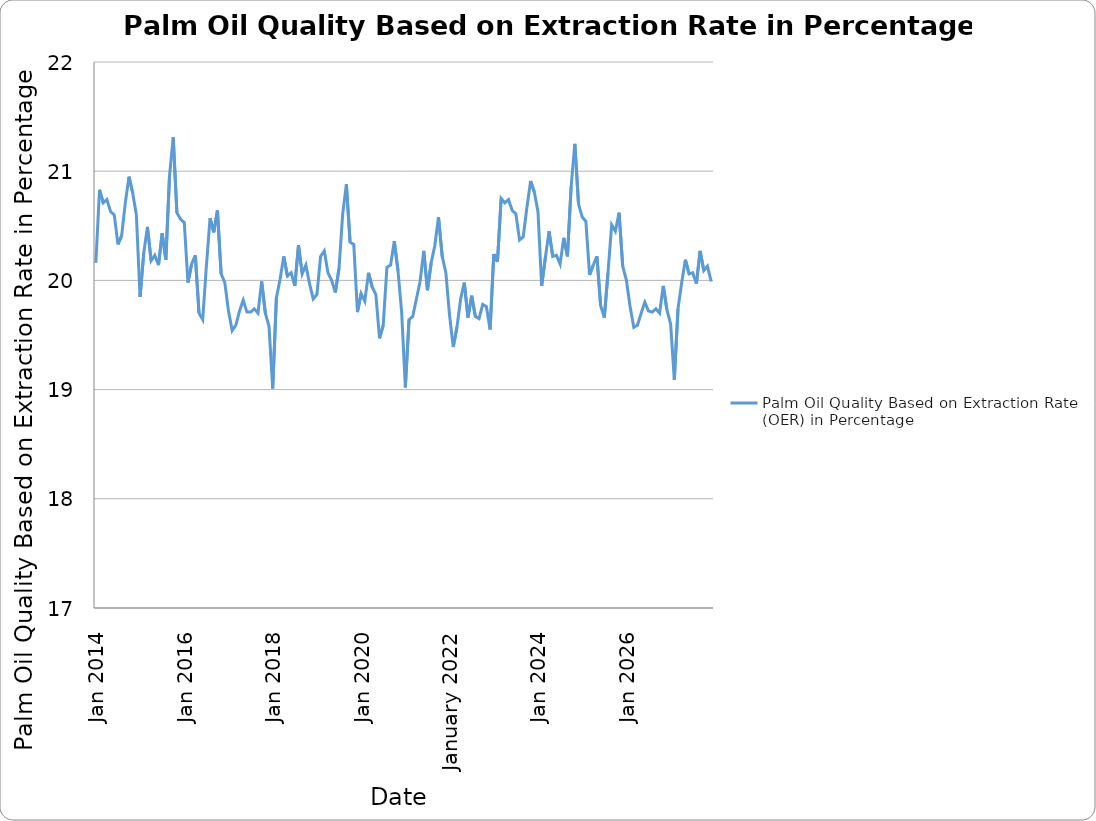
| Category | Palm Oil Quality Based on Extraction Rate (OER) in Percentage
 |
|---|---|
| 2014-01-01 | 20.16 |
| 2014-02-01 | 20.83 |
| 2014-03-01 | 20.71 |
| 2014-04-01 | 20.74 |
| 2014-05-01 | 20.63 |
| 2014-06-01 | 20.6 |
| 2014-07-01 | 20.33 |
| 2014-08-01 | 20.41 |
| 2014-09-01 | 20.71 |
| 2014-10-01 | 20.95 |
| 2014-11-01 | 20.8 |
| 2014-12-01 | 20.6 |
| 2015-01-01 | 19.85 |
| 2015-02-01 | 20.25 |
| 2015-03-01 | 20.49 |
| 2015-04-01 | 20.18 |
| 2015-05-01 | 20.23 |
| 2015-06-01 | 20.14 |
| 2015-07-01 | 20.43 |
| 2015-08-01 | 20.19 |
| 2015-09-01 | 20.96 |
| 2015-10-01 | 21.31 |
| 2015-11-01 | 20.62 |
| 2015-12-01 | 20.56 |
| 2016-01-01 | 20.53 |
| 2016-02-01 | 19.98 |
| 2016-03-01 | 20.15 |
| 2016-04-01 | 20.23 |
| 2016-05-01 | 19.7 |
| 2016-06-01 | 19.64 |
| 2016-07-01 | 20.13 |
| 2016-08-01 | 20.57 |
| 2016-09-01 | 20.44 |
| 2016-10-01 | 20.64 |
| 2016-11-01 | 20.06 |
| 2016-12-01 | 19.98 |
| 2017-01-01 | 19.72 |
| 2017-02-01 | 19.54 |
| 2017-03-01 | 19.59 |
| 2017-04-01 | 19.72 |
| 2017-05-01 | 19.82 |
| 2017-06-01 | 19.71 |
| 2017-07-01 | 19.71 |
| 2017-08-01 | 19.74 |
| 2017-09-01 | 19.7 |
| 2017-10-01 | 19.99 |
| 2017-11-01 | 19.7 |
| 2017-12-01 | 19.58 |
| 2018-01-01 | 19.01 |
| 2018-02-01 | 19.84 |
| 2018-03-01 | 20.01 |
| 2018-04-01 | 20.22 |
| 2018-05-01 | 20.04 |
| 2018-06-01 | 20.07 |
| 2018-07-01 | 19.95 |
| 2018-08-01 | 20.32 |
| 2018-09-01 | 20.06 |
| 2018-10-01 | 20.14 |
| 2018-11-01 | 19.97 |
| 2018-12-01 | 19.83 |
| 2019-01-01 | 19.87 |
| 2019-02-01 | 20.22 |
| 2019-03-01 | 20.27 |
| 2019-04-01 | 20.07 |
| 2019-05-01 | 20 |
| 2019-06-01 | 19.89 |
| 2019-07-01 | 20.11 |
| 2019-08-01 | 20.61 |
| 2019-09-01 | 20.88 |
| 2019-10-01 | 20.35 |
| 2019-11-01 | 20.33 |
| 2019-12-01 | 19.71 |
| 2020-01-01 | 19.88 |
| 2020-02-01 | 19.81 |
| 2020-03-01 | 20.07 |
| 2020-04-01 | 19.94 |
| 2020-05-01 | 19.87 |
| 2020-06-01 | 19.47 |
| 2020-07-01 | 19.59 |
| 2020-08-01 | 20.12 |
| 2020-09-01 | 20.14 |
| 2020-10-01 | 20.36 |
| 2020-11-01 | 20.09 |
| 2020-12-01 | 19.71 |
| 2021-01-01 | 19.02 |
| 2021-02-01 | 19.64 |
| 2021-03-01 | 19.67 |
| 2021-04-01 | 19.83 |
| 2021-05-01 | 19.99 |
| 2021-06-01 | 20.27 |
| 2021-07-01 | 19.91 |
| 2021-08-01 | 20.16 |
| 2021-09-01 | 20.32 |
| 2021-10-01 | 20.58 |
| 2021-11-01 | 20.22 |
| 2021-12-01 | 20.07 |
| 2022-01-01 | 19.68 |
| 2022-02-01 | 19.39 |
| 2022-03-01 | 19.57 |
| 2022-04-01 | 19.83 |
| 2022-05-01 | 19.98 |
| 2022-06-01 | 19.66 |
| 2022-07-01 | 19.86 |
| 2022-08-01 | 19.67 |
| 2022-09-01 | 19.65 |
| 2022-10-01 | 19.78 |
| 2022-11-01 | 19.76 |
| 2022-12-01 | 19.55 |
| 2023-01-01 | 20.24 |
| 2023-02-01 | 20.17 |
| 2023-03-01 | 20.75 |
| 2023-04-01 | 20.71 |
| 2023-05-01 | 20.74 |
| 2023-06-01 | 20.64 |
| 2023-07-01 | 20.61 |
| 2023-08-01 | 20.37 |
| 2023-09-01 | 20.4 |
| 2023-10-01 | 20.67 |
| 2023-11-01 | 20.91 |
| 2023-12-01 | 20.81 |
| 2024-01-01 | 20.63 |
| 2024-02-01 | 19.95 |
| 2024-03-01 | 20.21 |
| 2024-04-01 | 20.45 |
| 2024-05-01 | 20.22 |
| 2024-06-01 | 20.23 |
| 2024-07-01 | 20.15 |
| 2024-08-01 | 20.39 |
| 2024-09-01 | 20.22 |
| 2024-10-01 | 20.86 |
| 2024-11-01 | 21.25 |
| 2024-12-01 | 20.7 |
| 2025-01-01 | 20.58 |
| 2025-02-01 | 20.54 |
| 2025-03-01 | 20.05 |
| 2025-04-01 | 20.14 |
| 2025-05-01 | 20.22 |
| 2025-06-01 | 19.77 |
| 2025-07-01 | 19.66 |
| 2025-08-01 | 20.07 |
| 2025-09-01 | 20.51 |
| 2025-10-01 | 20.45 |
| 2025-11-01 | 20.62 |
| 2025-12-01 | 20.13 |
| 2026-01-01 | 20 |
| 2026-02-01 | 19.76 |
| 2026-03-01 | 19.57 |
| 2026-04-01 | 19.59 |
| 2026-05-01 | 19.7 |
| 2026-06-01 | 19.8 |
| 2026-07-01 | 19.72 |
| 2026-08-01 | 19.71 |
| 2026-09-01 | 19.74 |
| 2026-10-01 | 19.7 |
| 2026-11-01 | 19.95 |
| 2026-12-01 | 19.73 |
| 2027-01-01 | 19.6 |
| 2027-02-01 | 19.09 |
| 2027-03-01 | 19.74 |
| 2027-04-01 | 19.98 |
| 2027-05-01 | 20.19 |
| 2027-06-01 | 20.06 |
| 2027-07-01 | 20.07 |
| 2027-08-01 | 19.97 |
| 2027-09-01 | 20.27 |
| 2027-10-01 | 20.09 |
| 2027-11-01 | 20.13 |
| 2027-12-01 | 19.99 |